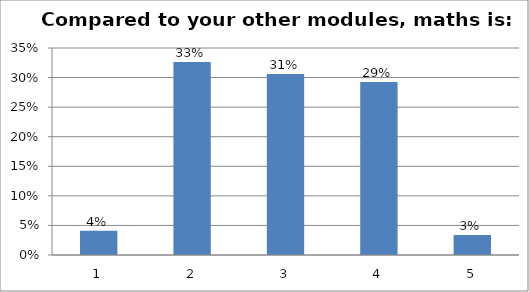
| Category | Series 0 |
|---|---|
| 0 | 0.041 |
| 1 | 0.327 |
| 2 | 0.306 |
| 3 | 0.293 |
| 4 | 0.034 |